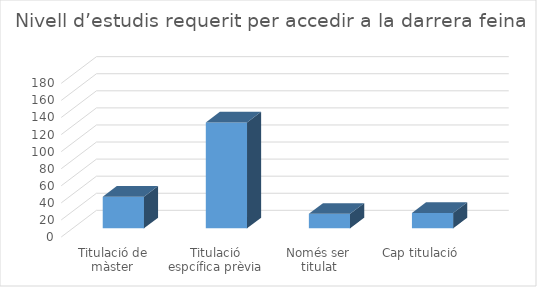
| Category | Series 0 |
|---|---|
| Titulació de màster | 37 |
| Titulació espcífica prèvia | 124 |
| Només ser titulat universitari | 17 |
| Cap titulació | 18 |